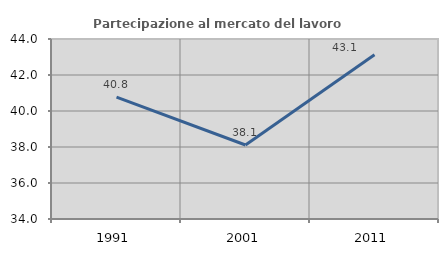
| Category | Partecipazione al mercato del lavoro  femminile |
|---|---|
| 1991.0 | 40.77 |
| 2001.0 | 38.112 |
| 2011.0 | 43.121 |